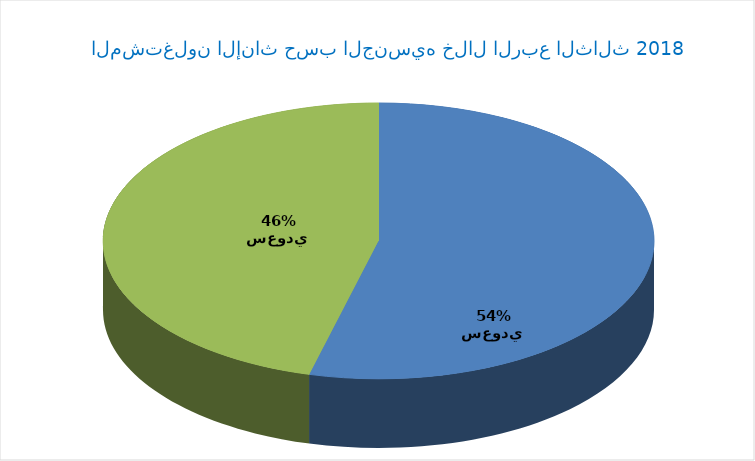
| Category | Series 0 |
|---|---|
| سعودي   | 166848 |
| غير سعودي  | 141918 |